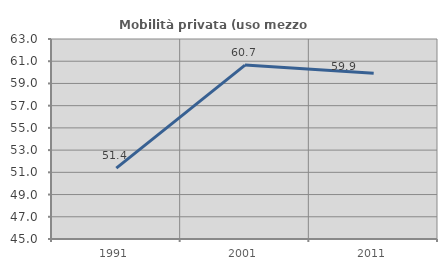
| Category | Mobilità privata (uso mezzo privato) |
|---|---|
| 1991.0 | 51.385 |
| 2001.0 | 60.656 |
| 2011.0 | 59.917 |